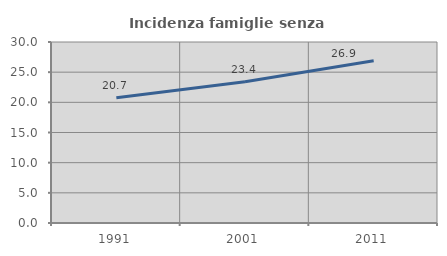
| Category | Incidenza famiglie senza nuclei |
|---|---|
| 1991.0 | 20.746 |
| 2001.0 | 23.405 |
| 2011.0 | 26.888 |